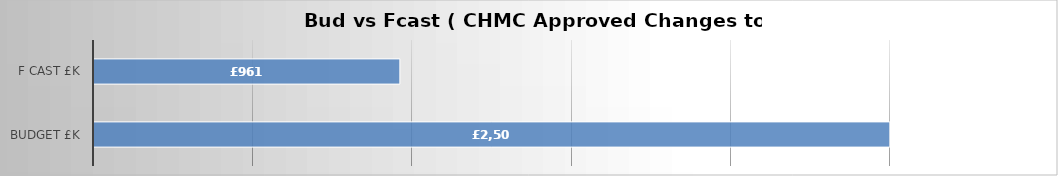
| Category | Series 0 |
|---|---|
| Budget £k | 2500 |
| F cast £k | 960.833 |